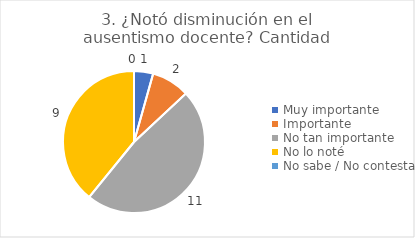
| Category | 3. ¿Notó disminución en el ausentismo docente? |
|---|---|
| Muy importante  | 0.043 |
| Importante  | 0.087 |
| No tan importante  | 0.478 |
| No lo noté  | 0.391 |
| No sabe / No contesta | 0 |